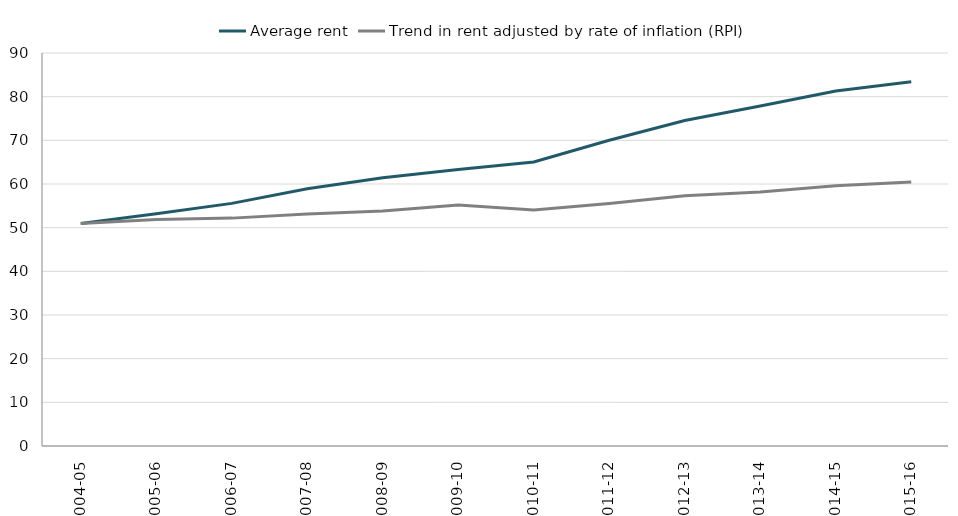
| Category | Average rent | Trend in rent adjusted by rate of inflation (RPI) |
|---|---|---|
| 2004-05 | 50.93 | 50.93 |
| 2005-06 | 53.21 | 51.844 |
| 2006-07 | 55.56 | 52.185 |
| 2007-08 | 58.91 | 53.137 |
| 2008-09 | 61.44 | 53.821 |
| 2009-10 | 63.32 | 55.215 |
| 2010-11 | 65.05 | 54.042 |
| 2011-12 | 70.031 | 55.516 |
| 2012-13 | 74.552 | 57.329 |
| 2013-14 | 77.844 | 58.182 |
| 2014-15 | 81.314 | 59.607 |
| 2015-16 | 83.395 | 60.481 |